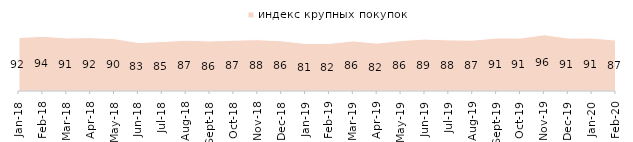
| Category | индекс крупных покупок |
|---|---|
| 2018-01-01 | 91.55 |
| 2018-02-01 | 93.75 |
| 2018-03-01 | 90.85 |
| 2018-04-01 | 91.5 |
| 2018-05-01 | 89.75 |
| 2018-06-01 | 82.95 |
| 2018-07-01 | 84.7 |
| 2018-08-01 | 87.05 |
| 2018-09-01 | 85.65 |
| 2018-10-01 | 87.15 |
| 2018-11-01 | 87.974 |
| 2018-12-01 | 85.95 |
| 2019-01-01 | 81.45 |
| 2019-02-01 | 81.55 |
| 2019-03-01 | 85.828 |
| 2019-04-01 | 81.98 |
| 2019-05-01 | 86.429 |
| 2019-06-01 | 89.027 |
| 2019-07-01 | 87.574 |
| 2019-08-01 | 87.213 |
| 2019-09-01 | 90.842 |
| 2019-10-01 | 90.644 |
| 2019-11-01 | 96.386 |
| 2019-12-01 | 90.644 |
| 2020-01-01 | 90.743 |
| 2020-02-01 | 87.228 |